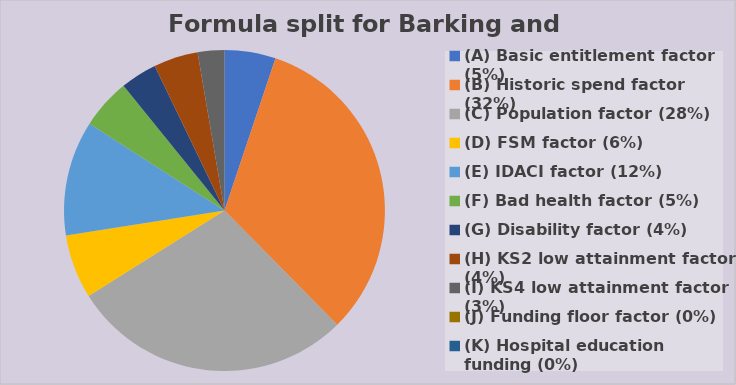
| Category | Series 0 |
|---|---|
| (A) Basic entitlement factor (5%) | 1979854.802 |
| (B) Historic spend factor (32%) | 12482620.907 |
| (C) Population factor (28%) | 10943862.671 |
| (D) FSM factor (6%) | 2477936.422 |
| (E) IDACI factor (12%) | 4456604.264 |
| (F) Bad health factor (5%) | 1949089.367 |
| (G) Disability factor (4%) | 1413243.58 |
| (H) KS2 low attainment factor (4%) | 1719138.192 |
| (I) KS4 low attainment factor (3%) | 1032550.657 |
| (J) Funding floor factor (0%) | 0 |
| (K) Hospital education funding (0%) | 0 |